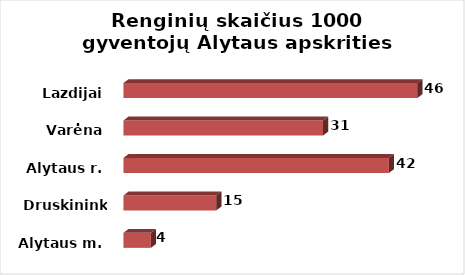
| Category | Series 0 |
|---|---|
| Alytaus m. | 4.325 |
| Druskininkai | 14.615 |
| Alytaus r. | 41.803 |
| Varėna | 31.428 |
| Lazdijai | 46.278 |